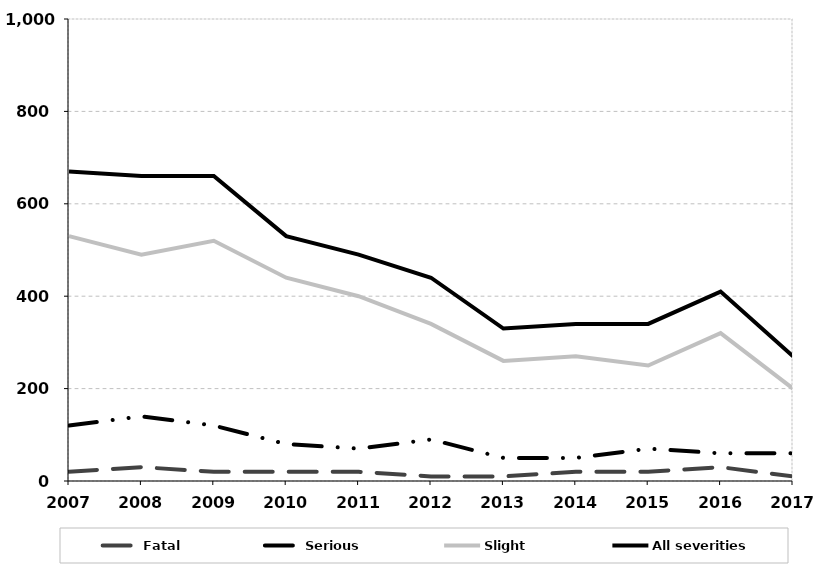
| Category | Fatal | Serious | Slight | All severities |
|---|---|---|---|---|
| 2007.0 | 20 | 120 | 530 | 670 |
| 2008.0 | 30 | 140 | 490 | 660 |
| 2009.0 | 20 | 120 | 520 | 660 |
| 2010.0 | 20 | 80 | 440 | 530 |
| 2011.0 | 20 | 70 | 400 | 490 |
| 2012.0 | 10 | 90 | 340 | 440 |
| 2013.0 | 10 | 50 | 260 | 330 |
| 2014.0 | 20 | 50 | 270 | 340 |
| 2015.0 | 20 | 70 | 250 | 340 |
| 2016.0 | 30 | 60 | 320 | 410 |
| 2017.0 | 10 | 60 | 200 | 270 |